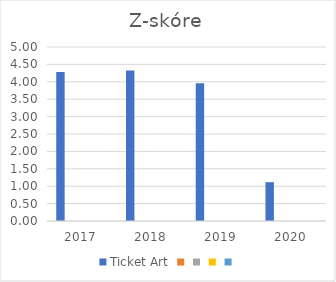
| Category | Ticket Art | Series 1 | Series 2 | Series 3 | Series 4 |
|---|---|---|---|---|---|
| 2017.0 | 4.283 |  |  |  |  |
| 2018.0 | 4.324 |  |  |  |  |
| 2019.0 | 3.958 |  |  |  |  |
| 2020.0 | 1.115 |  |  |  |  |